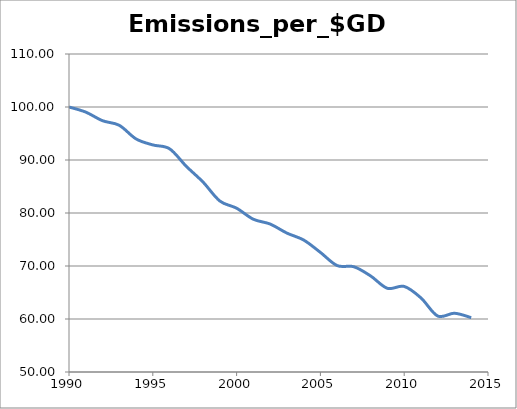
| Category | Emissions_per_$GDP |
|---|---|
| 1990.0 | 100 |
| 1991.0 | 99.038 |
| 1992.0 | 97.416 |
| 1993.0 | 96.544 |
| 1994.0 | 93.983 |
| 1995.0 | 92.846 |
| 1996.0 | 92.119 |
| 1997.0 | 88.799 |
| 1998.0 | 85.828 |
| 1999.0 | 82.261 |
| 2000.0 | 80.905 |
| 2001.0 | 78.82 |
| 2002.0 | 77.918 |
| 2003.0 | 76.209 |
| 2004.0 | 74.903 |
| 2005.0 | 72.566 |
| 2006.0 | 70.081 |
| 2007.0 | 69.854 |
| 2008.0 | 68.116 |
| 2009.0 | 65.787 |
| 2010.0 | 66.144 |
| 2011.0 | 63.982 |
| 2012.0 | 60.563 |
| 2013.0 | 61.084 |
| 2014.0 | 60.254 |